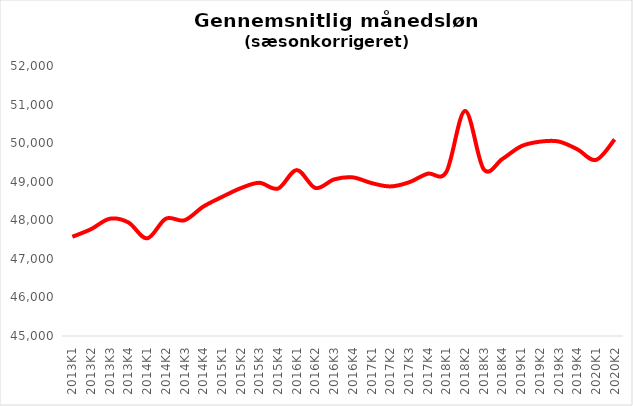
| Category | Series 0 |
|---|---|
| 2013K1 | 47572.594 |
| 2013K2 | 47770.188 |
| 2013K3 | 48040.037 |
| 2013K4 | 47943.146 |
| 2014K1 | 47531.579 |
| 2014K2 | 48041.569 |
| 2014K3 | 48000.577 |
| 2014K4 | 48354.257 |
| 2015K1 | 48604.745 |
| 2015K2 | 48831.65 |
| 2015K3 | 48971.53 |
| 2015K4 | 48822.302 |
| 2016K1 | 49302.021 |
| 2016K2 | 48837.129 |
| 2016K3 | 49059.969 |
| 2016K4 | 49112.036 |
| 2017K1 | 48964.796 |
| 2017K2 | 48878.053 |
| 2017K3 | 48984.115 |
| 2017K4 | 49208.232 |
| 2018K1 | 49253.448 |
| 2018K2 | 50835.671 |
| 2018K3 | 49320.586 |
| 2018K4 | 49590.994 |
| 2019K1 | 49919.496 |
| 2019K2 | 50038.13 |
| 2019K3 | 50043.59 |
| 2019K4 | 49841.636 |
| 2020K1 | 49564.248 |
| 2020K2 | 50096.027 |